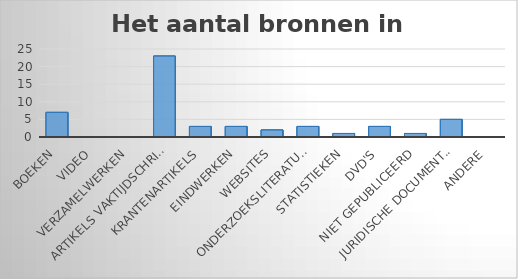
| Category | Series 0 |
|---|---|
| Boeken | 7 |
| Video | 0 |
| Verzamelwerken | 0 |
| Artikels vaktijdschriften | 23 |
| Krantenartikels | 3 |
| Eindwerken | 3 |
| Websites | 2 |
| Onderzoeksliteratuur | 3 |
| Statistieken | 1 |
| DVD's | 3 |
| Niet gepubliceerd | 1 |
| Juridische documenten | 5 |
| Andere | 0 |